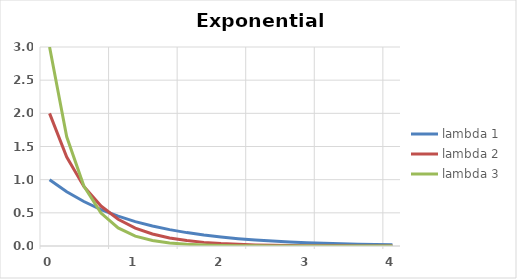
| Category | lambda 1 | lambda 2 | lambda 3 |
|---|---|---|---|
| 0.0 | 1 | 2 | 3 |
| 0.2 | 0.819 | 1.341 | 1.646 |
| 0.4 | 0.67 | 0.899 | 0.904 |
| 0.6000000000000001 | 0.549 | 0.602 | 0.496 |
| 0.8 | 0.449 | 0.404 | 0.272 |
| 1.0 | 0.368 | 0.271 | 0.149 |
| 1.2 | 0.301 | 0.181 | 0.082 |
| 1.4 | 0.247 | 0.122 | 0.045 |
| 1.5999999999999999 | 0.202 | 0.082 | 0.025 |
| 1.7999999999999998 | 0.165 | 0.055 | 0.014 |
| 1.9999999999999998 | 0.135 | 0.037 | 0.007 |
| 2.1999999999999997 | 0.111 | 0.025 | 0.004 |
| 2.4 | 0.091 | 0.016 | 0.002 |
| 2.6 | 0.074 | 0.011 | 0.001 |
| 2.8000000000000003 | 0.061 | 0.007 | 0.001 |
| 3.0000000000000004 | 0.05 | 0.005 | 0 |
| 3.2000000000000006 | 0.041 | 0.003 | 0 |
| 3.400000000000001 | 0.033 | 0.002 | 0 |
| 3.600000000000001 | 0.027 | 0.001 | 0 |
| 3.800000000000001 | 0.022 | 0.001 | 0 |
| 4.000000000000001 | 0.018 | 0.001 | 0 |